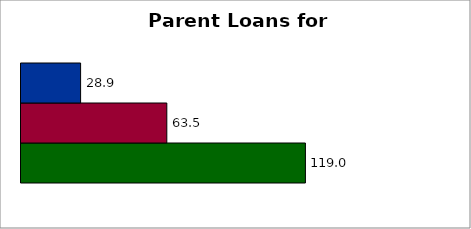
| Category | State | SREB states | 50 states and D.C. |
|---|---|---|---|
| 0 | 119.019 | 63.46 | 28.891 |